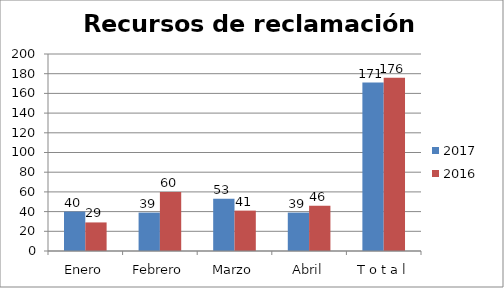
| Category | 2017 | 2016 |
|---|---|---|
| Enero | 40 | 29 |
| Febrero | 39 | 60 |
| Marzo | 53 | 41 |
| Abril | 39 | 46 |
| T o t a l | 171 | 176 |